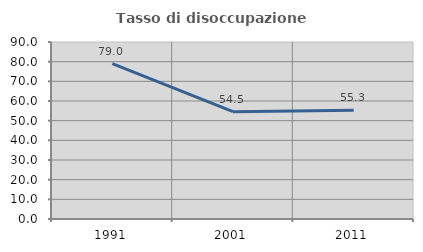
| Category | Tasso di disoccupazione giovanile  |
|---|---|
| 1991.0 | 79.048 |
| 2001.0 | 54.545 |
| 2011.0 | 55.263 |